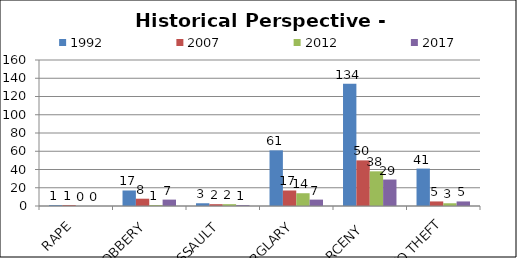
| Category | 1992 | 2007 | 2012 | 2017 |
|---|---|---|---|---|
| RAPE | 1 | 1 | 0 | 0 |
| ROBBERY | 17 | 8 | 1 | 7 |
| AGG ASSAULT | 3 | 2 | 2 | 1 |
| BURGLARY | 61 | 17 | 14 | 7 |
| LARCENY  | 134 | 50 | 38 | 29 |
| AUTO THEFT | 41 | 5 | 3 | 5 |